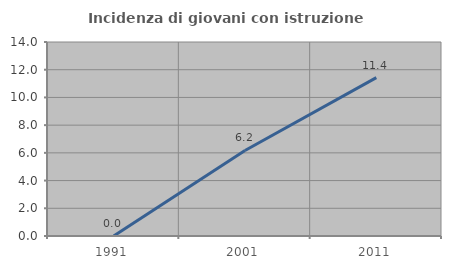
| Category | Incidenza di giovani con istruzione universitaria |
|---|---|
| 1991.0 | 0 |
| 2001.0 | 6.173 |
| 2011.0 | 11.429 |